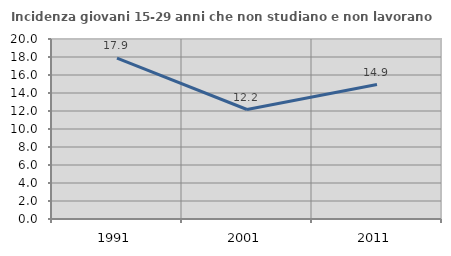
| Category | Incidenza giovani 15-29 anni che non studiano e non lavorano  |
|---|---|
| 1991.0 | 17.882 |
| 2001.0 | 12.166 |
| 2011.0 | 14.94 |